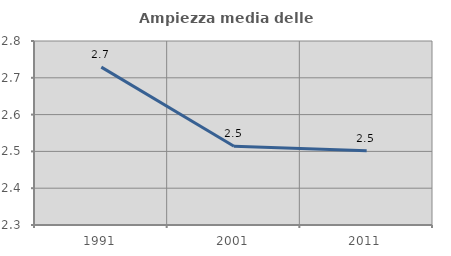
| Category | Ampiezza media delle famiglie |
|---|---|
| 1991.0 | 2.729 |
| 2001.0 | 2.514 |
| 2011.0 | 2.502 |